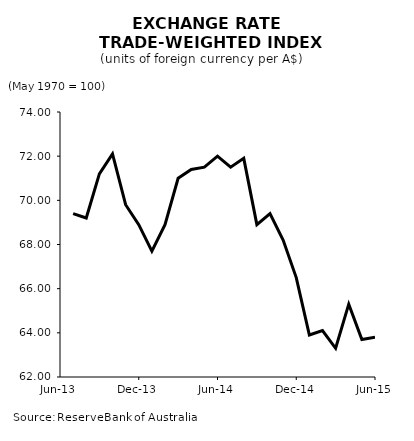
| Category | Series 24 |
|---|---|
| 2013-07-01 | 69.4 |
| 2013-08-01 | 69.2 |
| 2013-09-01 | 71.2 |
| 2013-10-01 | 72.1 |
| 2013-11-01 | 69.8 |
| 2013-12-01 | 68.9 |
| 2014-01-01 | 67.7 |
| 2014-02-01 | 68.9 |
| 2014-03-01 | 71 |
| 2014-04-01 | 71.4 |
| 2014-05-01 | 71.5 |
| 2014-06-01 | 72 |
| 2014-07-01 | 71.5 |
| 2014-08-01 | 71.9 |
| 2014-09-01 | 68.9 |
| 2014-10-01 | 69.4 |
| 2014-11-01 | 68.2 |
| 2014-12-01 | 66.5 |
| 2015-01-01 | 63.9 |
| 2015-02-01 | 64.1 |
| 2015-03-01 | 63.3 |
| 2015-04-01 | 65.3 |
| 2015-05-01 | 63.7 |
| 2015-06-01 | 63.8 |